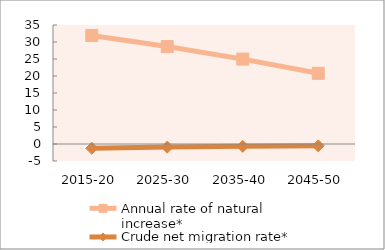
| Category | Annual rate of natural increase* | Crude net migration rate* |
|---|---|---|
| 2015-20 | 31.916 | -1.251 |
| 2025-30 | 28.648 | -0.915 |
| 2035-40 | 24.965 | -0.691 |
| 2045-50 | 20.787 | -0.542 |